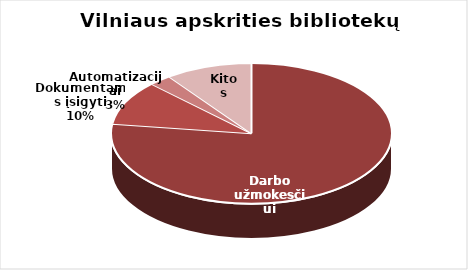
| Category | Series 0 |
|---|---|
| Darbo užmokesčiui | 6253981.4 |
| Dokumentams įsigyti | 831531.2 |
| Automatizacijai | 209491 |
| Kitos | 810747.5 |